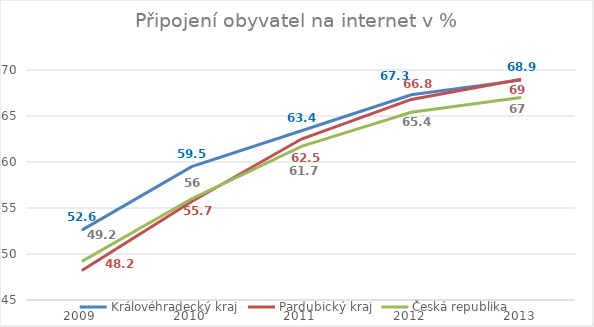
| Category | Královéhradecký kraj | Pardubický kraj | Česká republika |
|---|---|---|---|
| 2009.0 | 52.6 | 48.2 | 49.2 |
| 2010.0 | 59.5 | 55.7 | 56 |
| 2011.0 | 63.4 | 62.5 | 61.7 |
| 2012.0 | 67.3 | 66.8 | 65.4 |
| 2013.0 | 68.9 | 69 | 67 |